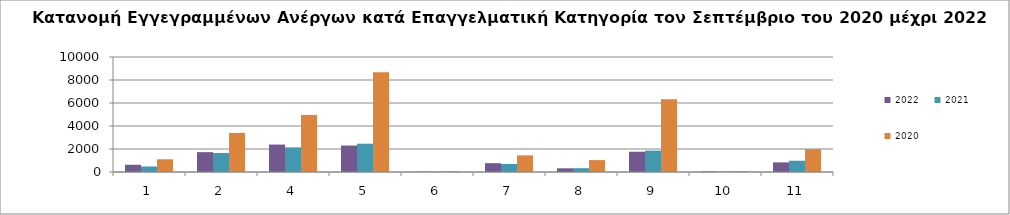
| Category | 2022 | 2021 | 2020 |
|---|---|---|---|
| 1.0 | 628 | 478 | 1105 |
| 2.0 | 1728 | 1651 | 3399 |
| 4.0 | 2385 | 2141 | 4966 |
| 5.0 | 2301 | 2461 | 8680 |
| 6.0 | 24 | 24 | 59 |
| 7.0 | 766 | 700 | 1445 |
| 8.0 | 321 | 332 | 1034 |
| 9.0 | 1762 | 1859 | 6331 |
| 10.0 | 49 | 32 | 68 |
| 11.0 | 837 | 981 | 1979 |